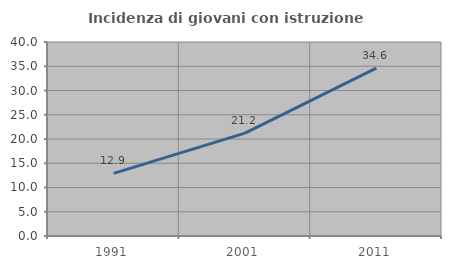
| Category | Incidenza di giovani con istruzione universitaria |
|---|---|
| 1991.0 | 12.907 |
| 2001.0 | 21.216 |
| 2011.0 | 34.617 |